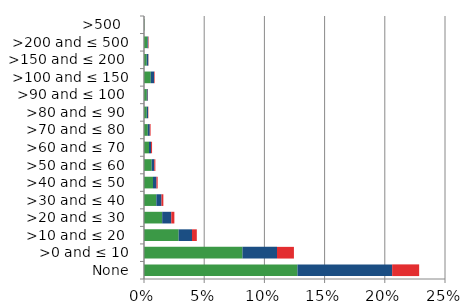
| Category | England | Scotland | Wales |
|---|---|---|---|
|  None | 0.127 | 0.079 | 0.022 |
| >0 and ≤ 10 | 0.082 | 0.029 | 0.014 |
| >10 and ≤ 20  | 0.029 | 0.011 | 0.004 |
| >20 and ≤ 30  | 0.015 | 0.008 | 0.003 |
| >30 and ≤ 40  | 0.01 | 0.004 | 0.002 |
| >40 and ≤ 50  | 0.007 | 0.003 | 0.001 |
| >50 and ≤ 60  | 0.006 | 0.002 | 0.001 |
| >60 and ≤ 70  | 0.004 | 0.002 | 0.001 |
| >70 and ≤ 80  | 0.003 | 0.002 | 0.001 |
| >80 and ≤ 90  | 0.002 | 0.001 | 0 |
| >90 and ≤ 100  | 0.002 | 0.001 | 0 |
| >100 and ≤ 150 | 0.006 | 0.003 | 0 |
| >150 and ≤ 200  | 0.002 | 0.001 | 0 |
| >200 and ≤ 500 | 0.003 | 0.001 | 0 |
| >500   | 0 | 0 | 0 |